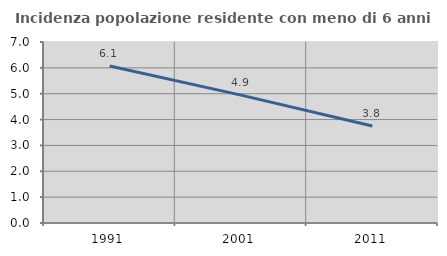
| Category | Incidenza popolazione residente con meno di 6 anni |
|---|---|
| 1991.0 | 6.073 |
| 2001.0 | 4.946 |
| 2011.0 | 3.75 |